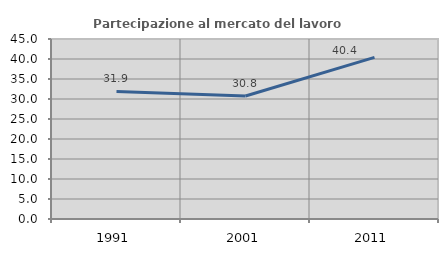
| Category | Partecipazione al mercato del lavoro  femminile |
|---|---|
| 1991.0 | 31.905 |
| 2001.0 | 30.765 |
| 2011.0 | 40.395 |